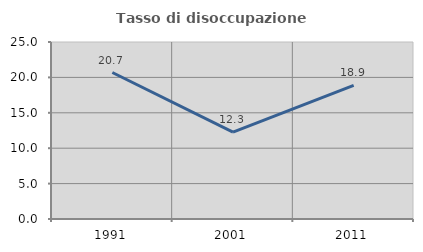
| Category | Tasso di disoccupazione giovanile  |
|---|---|
| 1991.0 | 20.69 |
| 2001.0 | 12.281 |
| 2011.0 | 18.868 |